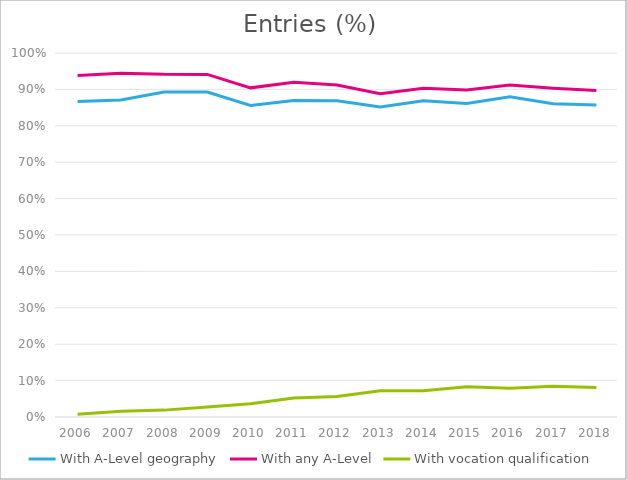
| Category | With A-Level geography | With any A-Level | With vocation qualification |
|---|---|---|---|
| 2006.0 | 0.866 | 0.938 | 0.008 |
| 2007.0 | 0.871 | 0.945 | 0.016 |
| 2008.0 | 0.893 | 0.942 | 0.019 |
| 2009.0 | 0.893 | 0.941 | 0.027 |
| 2010.0 | 0.856 | 0.904 | 0.036 |
| 2011.0 | 0.869 | 0.92 | 0.052 |
| 2012.0 | 0.869 | 0.912 | 0.056 |
| 2013.0 | 0.852 | 0.888 | 0.072 |
| 2014.0 | 0.869 | 0.903 | 0.072 |
| 2015.0 | 0.861 | 0.898 | 0.083 |
| 2016.0 | 0.88 | 0.912 | 0.079 |
| 2017.0 | 0.86 | 0.903 | 0.084 |
| 2018.0 | 0.857 | 0.897 | 0.081 |